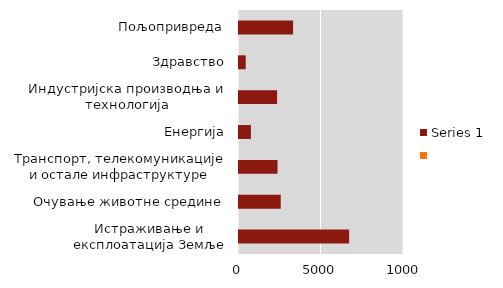
| Category | Series 1 |
|---|---|
| Истраживање и експлоатација Земље |  |
| Очување животне средине |  |
| Транспорт, телекомуникације и остале инфраструктуре |  |
| Енергија |  |
| Индустријска производња и технологија |  |
| Здравство |  |
| Пољопривреда |  |